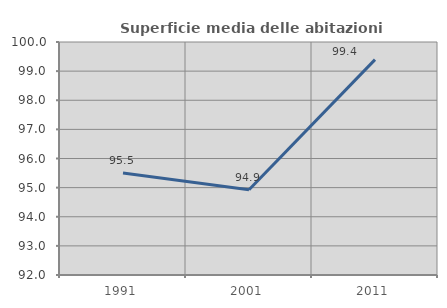
| Category | Superficie media delle abitazioni occupate |
|---|---|
| 1991.0 | 95.5 |
| 2001.0 | 94.929 |
| 2011.0 | 99.395 |